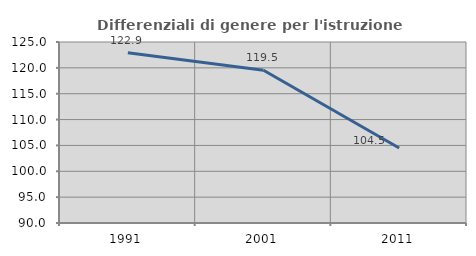
| Category | Differenziali di genere per l'istruzione superiore |
|---|---|
| 1991.0 | 122.933 |
| 2001.0 | 119.549 |
| 2011.0 | 104.507 |